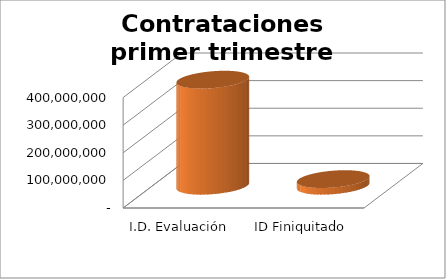
| Category | Series 0 |
|---|---|
| I.D. Evaluación  | 384099885 |
| ID Finiquitado  | 24037150 |